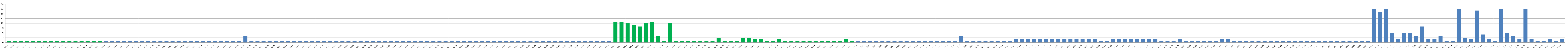
| Category | Series 0 |
|---|---|
| AW01 | 1 |
| AW02 | 1 |
| AW03 | 1 |
| AW04 | 1 |
| AW05 | 1 |
| AW06 | 1 |
| AW07 | 1 |
| AW08 | 1 |
| AW09 | 1 |
| AW10 | 1 |
| AW11 | 1 |
| AW12 | 1 |
| AW13 | 1 |
| AW14 | 1 |
| AW15 | 1 |
| AW16 | 1 |
| AW17 | 1 |
| AW18 | 1 |
| AW19 | 1 |
| AW20 | 1 |
| AW21 | 1 |
| AW22 | 1 |
| AW23 | 1 |
| AW24 | 1 |
| AW25 | 1 |
| AW26 | 1 |
| BW01 | 1 |
| BW02 | 1 |
| BW03 | 1 |
| BWO4 | 1 |
| BW05 | 1 |
| BW06 | 1 |
| BW07 | 1 |
| BW08 | 1 |
| BW09 | 1 |
| BW10 | 1 |
| BW11 | 1 |
| BW12 | 1 |
| BW13 | 1 |
| BW14 | 4 |
| BW15 | 1 |
| BW16 | 1 |
| BW17 | 1 |
| BW18 | 1 |
| BW19 | 1 |
| BW20 | 1 |
| BW21 | 1 |
| BW22 | 1 |
| BW23 | 1 |
| BW24 | 1 |
| BW25 | 1 |
| BW26 | 1 |
| CW01 | 1 |
| CW02 | 1 |
| CW03 | 1 |
| CW04 | 1 |
| CW05 | 1 |
| CW06 | 1 |
| CW07 | 1 |
| CW08 | 1 |
| CW09 | 1 |
| CW10 | 1 |
| CW11 | 1 |
| CW12 | 1 |
| CW13 | 1 |
| CW14 | 1 |
| CW15 | 1 |
| CW16 | 1 |
| CW17 | 1 |
| CW18 | 1 |
| CW19 | 1 |
| CW20 | 1 |
| CW21 | 1 |
| CW22 | 1 |
| CW23 | 1 |
| CW24 | 1 |
| CW25 | 1 |
| CW26 | 1 |
| CW27 | 1 |
| CW28 | 1 |
| CW29 | 1 |
| CW30 | 1 |
| CW31 | 1 |
| CW32 | 1 |
| CW33 | 1 |
| CW34 | 1 |
| CW35 | 1 |
| CW36 | 1 |
| CW37 | 1 |
| CW38 | 1 |
| CW39 | 1 |
| CW40 | 1 |
| CW41 | 1 |
| CW42 | 1 |
| CW43 | 1 |
| CW44 | 1 |
| CW45 | 1 |
| CW46 | 1 |
| CW47 | 1 |
| CW48 | 1 |
| DW01 | 13 |
| DW02 | 13 |
| DW03 | 12 |
| DW04 | 11 |
| DW05 | 10 |
| DW06 | 12 |
| DW07 | 13 |
| DW08 | 4 |
| DW09 | 1 |
| DW10 | 12 |
| DW11 | 1 |
| DW12 | 1 |
| DW13 | 1 |
| DW14 | 1 |
| DW15 | 1 |
| DW16 | 1 |
| DW17 | 1 |
| DW18 | 3 |
| DW19 | 1 |
| DW20 | 1 |
| DW21 | 1 |
| DW22 | 3 |
| DW23 | 3 |
| DW24 | 2 |
| DW25 | 2 |
| DW26 | 1 |
| DW27 | 1 |
| DW28 | 2 |
| DW29 | 1 |
| DW30 | 1 |
| DW31 | 1 |
| DW32 | 1 |
| DW33 | 1 |
| DW34 | 1 |
| DW35 | 1 |
| DW36 | 1 |
| DW37 | 1 |
| DW38 | 1 |
| DW39 | 2 |
| DW40 | 1 |
| AU01 | 1 |
| AU02 | 1 |
| AU03 | 1 |
| AU04 | 1 |
| AU05 | 1 |
| AU06 | 1 |
| AU07 | 1 |
| AU08 | 1 |
| AU09 | 1 |
| AU10 | 1 |
| AU11 | 1 |
| BU01 | 1 |
| BU02 | 1 |
| BU03 | 1 |
| BU04 | 1 |
| BU05 | 1 |
| BU06 | 1 |
| BU07 | 4 |
| BU08 | 1 |
| BU09 | 1 |
| BU10 | 1 |
| BU11 | 1 |
| BU12 | 1 |
| BU13 | 1 |
| BU14 | 1 |
| BU15 | 1 |
| BU16 | 2 |
| BU17 | 2 |
| CU01 | 2 |
| CU02 | 2 |
| CU03 | 2 |
| CU04 | 2 |
| CU05 | 2 |
| CU06 | 2 |
| CU07 | 2 |
| CU08 | 2 |
| CU09 | 2 |
| CU10 | 2 |
| CU11 | 2 |
| CU12 | 2 |
| CU13 | 1 |
| CU14 | 1 |
| CU15 | 2 |
| CU16 | 2 |
| CU17 | 2 |
| CU18 | 2 |
| CU19 | 2 |
| CU20 | 2 |
| CU21 | 2 |
| CU22 | 2 |
| CU23 | 1 |
| CU24 | 1 |
| CU25 | 1 |
| CU26 | 2 |
| CU27 | 1 |
| CU28 | 1 |
| CU29 | 1 |
| CU30 | 1 |
| CU31 | 1 |
| CU32 | 1 |
| CU33 | 2 |
| CU34 | 2 |
| CU35 | 1 |
| CU36 | 1 |
| CU37 | 1 |
| CU38 | 1 |
| CU39 | 1 |
| CU40 | 1 |
| CU41 | 1 |
| CU42 | 1 |
| CU43 | 1 |
| CU44 | 1 |
| CU45 | 1 |
| CU46 | 1 |
| CU47 | 1 |
| CU48 | 1 |
| CU49 | 1 |
| CU50 | 1 |
| CU51 | 1 |
| CU52 | 1 |
| CU53 | 1 |
| CU54 | 1 |
| CU55 | 1 |
| CU56 | 1 |
| CU57 | 1 |
| DU01 | 21 |
| DU02 | 19 |
| DU03 | 21 |
| DU04 | 6 |
| DU05 | 2 |
| DU06 | 6 |
| DU07 | 6 |
| DU08 | 4 |
| DU09 | 10 |
| DU10 | 2 |
| DU11 | 2 |
| DU12 | 4 |
| DU13 | 1 |
| DU14 | 1 |
| DU15 | 21 |
| DU16 | 3 |
| DU17 | 2 |
| DU18 | 20 |
| DU19 | 5 |
| DU20 | 2 |
| DU21 | 1 |
| DU22 | 21 |
| DU23 | 6 |
| DU24 | 4 |
| DU25 | 2 |
| DU26 | 21 |
| DU27 | 2 |
| DU28 | 1 |
| DU29 | 1 |
| DU30 | 2 |
| DU31 | 1 |
| DU32 | 2 |